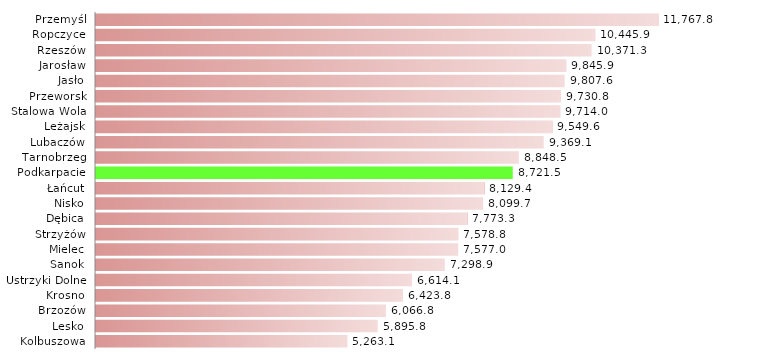
| Category | Prace interwencyjne |
|---|---|
| Kolbuszowa | 5263.067 |
| Lesko | 5895.822 |
| Brzozów | 6066.805 |
| Krosno | 6423.76 |
| Ustrzyki Dolne | 6614.15 |
| Sanok | 7298.925 |
| Mielec | 7577.027 |
| Strzyżów | 7578.78 |
| Dębica | 7773.3 |
| Nisko | 8099.697 |
| Łańcut | 8129.426 |
| Podkarpacie | 8721.524 |
| Tarnobrzeg | 8848.482 |
| Lubaczów | 9369.117 |
| Leżajsk | 9549.624 |
| Stalowa Wola | 9714.02 |
| Przeworsk | 9730.785 |
| Jasło | 9807.595 |
| Jarosław | 9845.926 |
| Rzeszów | 10371.264 |
| Ropczyce | 10445.929 |
| Przemyśl | 11767.826 |